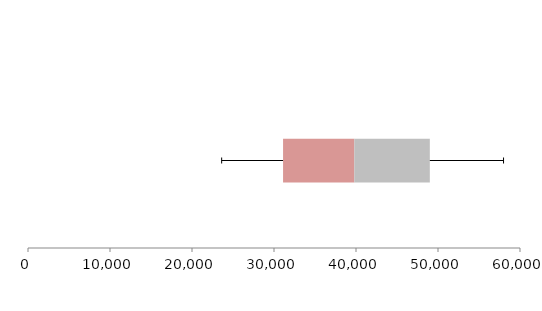
| Category | Series 1 | Series 2 | Series 3 |
|---|---|---|---|
| 0 | 31105.131 | 8685.409 | 9213.03 |